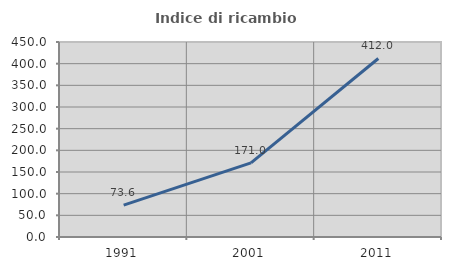
| Category | Indice di ricambio occupazionale  |
|---|---|
| 1991.0 | 73.636 |
| 2001.0 | 171.014 |
| 2011.0 | 412 |